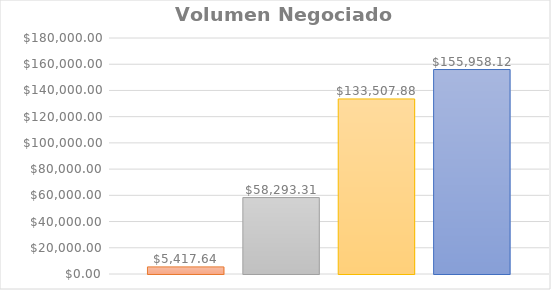
| Category | Lunes | Martes | Miercoles | Jueves | Viernes |
|---|---|---|---|---|---|
| 0 |  | 5417.64 | 58293.31 | 133507.88 | 155958.12 |